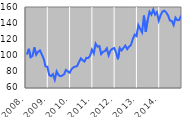
| Category | Series 0 |
|---|---|
| 2008. | 101.221 |
| 2  | 108.435 |
| 3  | 97.89 |
| 4  | 99.625 |
| 5  | 110.034 |
| 6  | 101.113 |
| 7  | 104.57 |
| 8  | 106.41 |
| 9  | 101.457 |
| 10  | 96.173 |
| 11  | 86.792 |
| 12  | 86.281 |
| 2009. | 76.032 |
| 2  | 74.608 |
| 3  | 77.104 |
| 4  | 70.252 |
| 5  | 80.467 |
| 6  | 76.096 |
| 7  | 74.488 |
| 8  | 75.317 |
| 9  | 76.868 |
| 10  | 82.312 |
| 11  | 80.404 |
| 12  | 78.89 |
| 2010. | 83.195 |
| 2  | 85.352 |
| 3  | 86.405 |
| 4  | 87.002 |
| 5  | 91.968 |
| 6  | 96.59 |
| 7  | 94.216 |
| 8  | 92.672 |
| 9  | 97.197 |
| 10  | 97.03 |
| 11  | 99.788 |
| 12  | 107.322 |
| 2011. | 102.689 |
| 2  | 114.811 |
| 3  | 110.988 |
| 4  | 111.845 |
| 5  | 101.787 |
| 6  | 104.671 |
| 7  | 105.628 |
| 8  | 108.957 |
| 9  | 100.386 |
| 10  | 106.264 |
| 11  | 108.407 |
| 12  | 109.264 |
| 2012. | 103.963 |
| 2  | 95.494 |
| 3  | 109.328 |
| 4  | 106.412 |
| 5  | 109.468 |
| 6  | 112.337 |
| 7  | 107.986 |
| 8  | 110.983 |
| 9  | 113.055 |
| 10  | 120.361 |
| 11  | 125.835 |
| 12  | 124.077 |
| 2013. | 137.608 |
| 2  | 133.037 |
| 3  | 128.681 |
| 4  | 149.385 |
| 5  | 129.423 |
| 6  | 143.837 |
| 7  | 154.084 |
| 8  | 150.541 |
| 9  | 156.869 |
| 10  | 150.568 |
| 11  | 153.674 |
| 12  | 143.139 |
| 2014. | 150.044 |
| 2  | 154.326 |
| 3  | 155.442 |
| 4  | 153.18 |
| 5  | 149.499 |
| 6  | 143.268 |
| 7  | 142.914 |
| 8  | 137.738 |
| 9  | 146.882 |
| 10  | 143.698 |
| 11  | 143.918 |
| 12  | 149.441 |